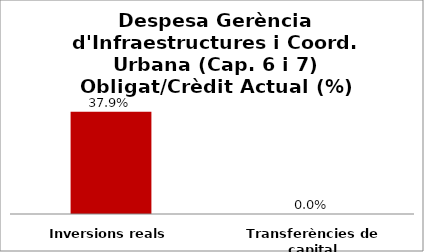
| Category | Series 0 |
|---|---|
| Inversions reals | 0.379 |
| Transferències de capital | 0 |